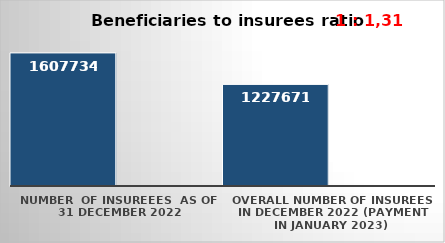
| Category | Series 0 | Series 1 |
|---|---|---|
| NUMBER  of insureees  as of  31 December 2022 | 1607734 |  |
| OVERALL number of insurees in December 2022 (payment in January 2023) | 1227671 |  |